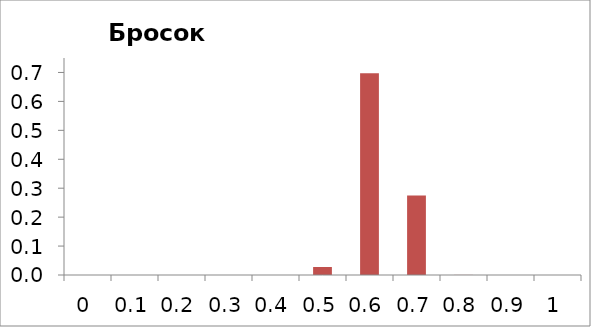
| Category | Series 1 |
|---|---|
| 0.0 | 0 |
| 0.1 | 0 |
| 0.2 | 0 |
| 0.3 | 0 |
| 0.4 | 0 |
| 0.5 | 0.028 |
| 0.6 | 0.698 |
| 0.7 | 0.274 |
| 0.8 | 0 |
| 0.9 | 0 |
| 1.0 | 0 |